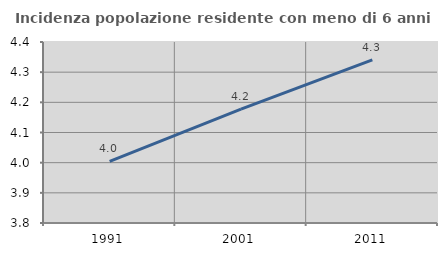
| Category | Incidenza popolazione residente con meno di 6 anni |
|---|---|
| 1991.0 | 4.005 |
| 2001.0 | 4.178 |
| 2011.0 | 4.341 |